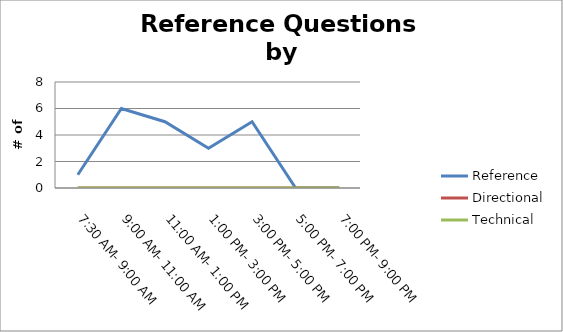
| Category | Reference | Directional | Technical |
|---|---|---|---|
| 7:30 AM- 9:00 AM | 1 | 0 | 0 |
| 9:00 AM- 11:00 AM | 6 | 0 | 0 |
| 11:00 AM- 1:00 PM | 5 | 0 | 0 |
| 1:00 PM- 3:00 PM | 3 | 0 | 0 |
| 3:00 PM- 5:00 PM | 5 | 0 | 0 |
| 5:00 PM- 7:00 PM | 0 | 0 | 0 |
| 7:00 PM- 9:00 PM | 0 | 0 | 0 |